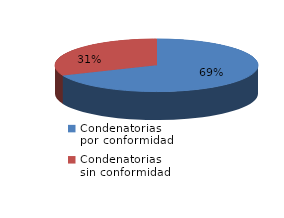
| Category | Series 0 |
|---|---|
| 0 | 1377 |
| 1 | 628 |